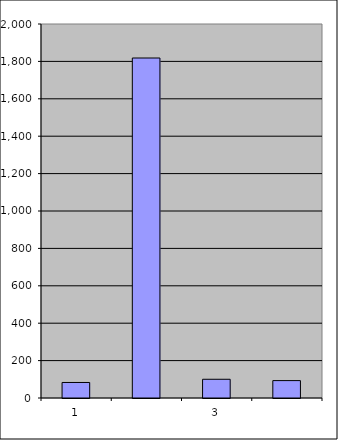
| Category | Series 0 |
|---|---|
| 0 | 83 |
| 1 | 1818.136 |
| 2 | 100.173 |
| 3 | 93.068 |